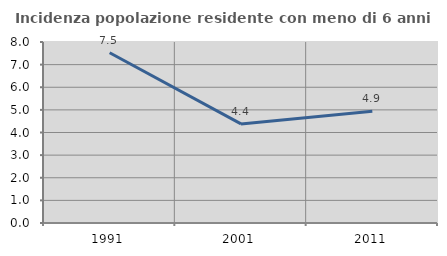
| Category | Incidenza popolazione residente con meno di 6 anni |
|---|---|
| 1991.0 | 7.525 |
| 2001.0 | 4.379 |
| 2011.0 | 4.935 |